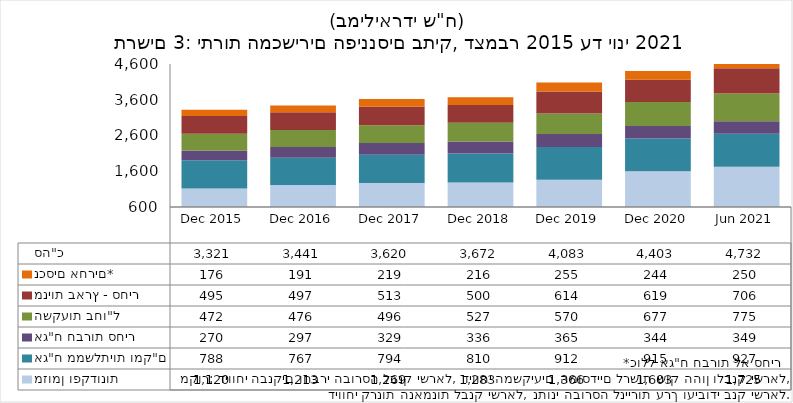
| Category | מזומן ופקדונות | אג"ח ממשלתיות ומק"ם | אג"ח חברות סחיר | השקעות בחו"ל | מניות בארץ - סחיר | נכסים אחרים* | סה"כ |
|---|---|---|---|---|---|---|---|
| 2015-12-31 | 1120.29 | 787.68 | 270.07 | 472.08 | 494.51 | 176.15 | 3320.78 |
| 2016-12-31 | 1212.62 | 766.81 | 297.12 | 475.83 | 497.33 | 191.24 | 3440.95 |
| 2017-12-31 | 1268.97 | 793.97 | 329.2 | 496.34 | 512.85 | 218.96 | 3620.29 |
| 2018-12-31 | 1283.26 | 809.81 | 335.75 | 527.47 | 499.59 | 216.42 | 3672.3 |
| 2019-12-31 | 1365.73 | 911.91 | 365.33 | 570.44 | 614.38 | 255.49 | 4083.28 |
| 2020-12-31 | 1603.4 | 914.88 | 344.4 | 676.86 | 619.35 | 244.3 | 4403.19 |
| 2021-06-30 | 1724.59 | 927.47 | 348.94 | 775.22 | 705.75 | 249.55 | 4731.52 |